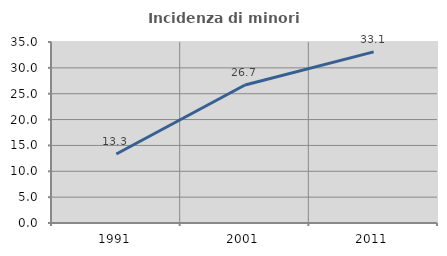
| Category | Incidenza di minori stranieri |
|---|---|
| 1991.0 | 13.333 |
| 2001.0 | 26.69 |
| 2011.0 | 33.086 |